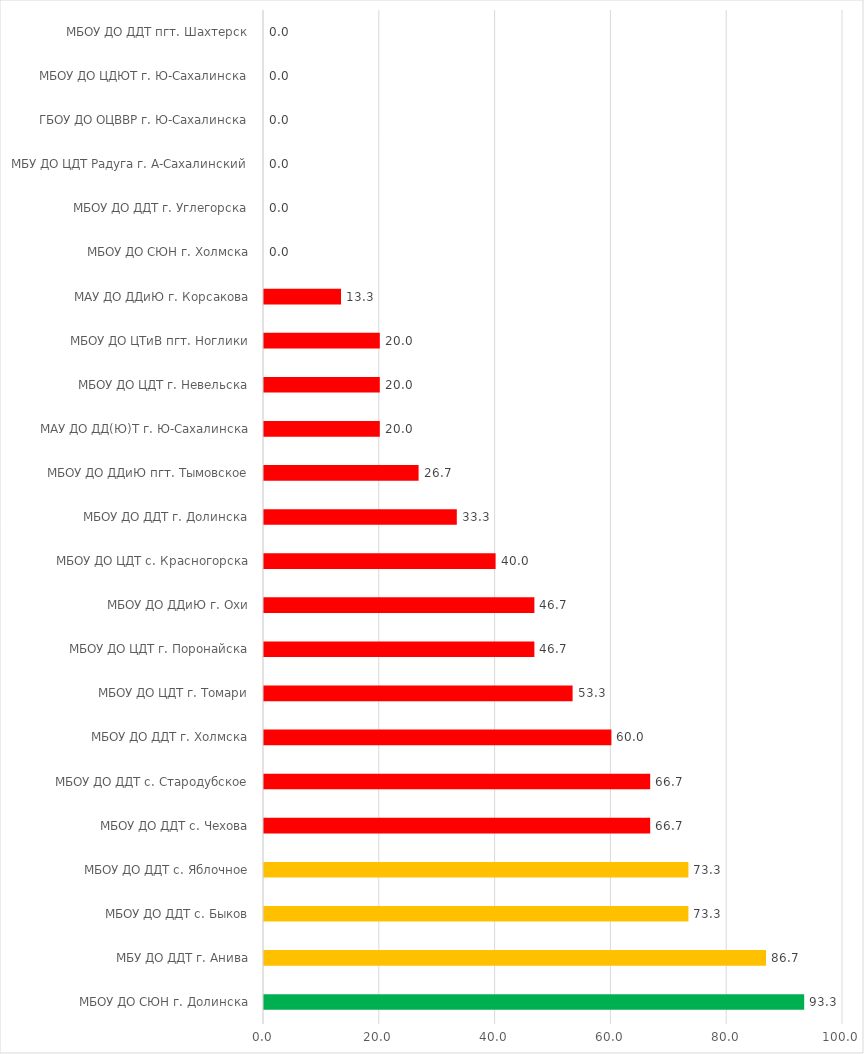
| Category | Series 0 |
|---|---|
| МБОУ ДО СЮН г. Долинска | 93.3 |
| МБУ ДО ДДТ г. Анива | 86.7 |
| МБОУ ДО ДДТ с. Быков | 73.3 |
| МБОУ ДО ДДТ с. Яблочное | 73.3 |
| МБОУ ДО ДДТ с. Чехова | 66.7 |
| МБОУ ДО ДДТ с. Стародубское | 66.7 |
| МБОУ ДО ДДТ г. Холмска | 60 |
| МБОУ ДО ЦДТ г. Томари | 53.3 |
| МБОУ ДО ЦДТ г. Поронайска | 46.7 |
| МБОУ ДО ДДиЮ г. Охи | 46.7 |
| МБОУ ДО ЦДТ с. Красногорска | 40 |
| МБОУ ДО ДДТ г. Долинска | 33.3 |
| МБОУ ДО ДДиЮ пгт. Тымовское | 26.7 |
| МАУ ДО ДД(Ю)Т г. Ю-Сахалинска | 20 |
| МБОУ ДО ЦДТ г. Невельска | 20 |
| МБОУ ДО ЦТиВ пгт. Ноглики | 20 |
| МАУ ДО ДДиЮ г. Корсакова | 13.3 |
| МБОУ ДО СЮН г. Холмска | 0 |
| МБОУ ДО ДДТ г. Углегорска | 0 |
| МБУ ДО ЦДТ Радуга г. А-Сахалинский | 0 |
| ГБОУ ДО ОЦВВР г. Ю-Сахалинска | 0 |
| МБОУ ДО ЦДЮТ г. Ю-Сахалинска | 0 |
| МБОУ ДО ДДТ пгт. Шахтерск | 0 |